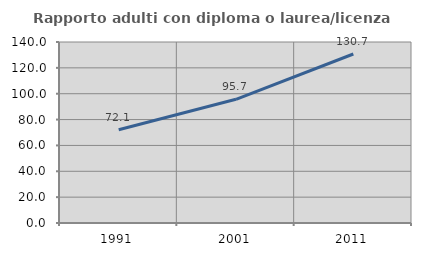
| Category | Rapporto adulti con diploma o laurea/licenza media  |
|---|---|
| 1991.0 | 72.07 |
| 2001.0 | 95.667 |
| 2011.0 | 130.724 |